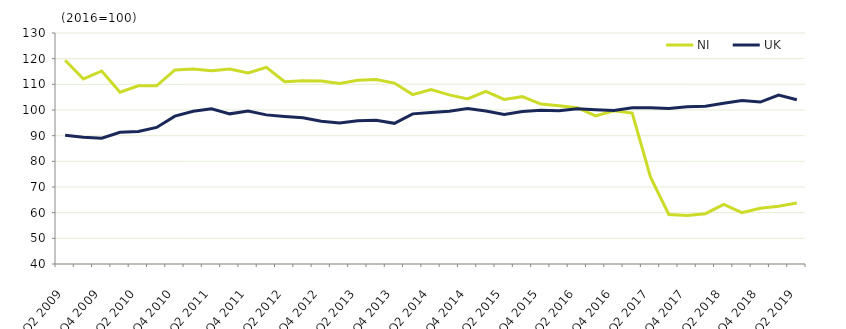
| Category | NI  | UK  |
|---|---|---|
| Q2 2009 | 119.4 | 90.2 |
|  | 112.1 | 89.4 |
| Q4 2009 | 115.2 | 89 |
|  | 106.9 | 91.3 |
| Q2 2010 | 109.4 | 91.6 |
|  | 109.4 | 93.2 |
| Q4 2010 | 115.6 | 97.6 |
|  | 116 | 99.5 |
| Q2 2011 | 115.3 | 100.5 |
|  | 116 | 98.5 |
| Q4 2011 | 114.4 | 99.6 |
|  | 116.6 | 98.1 |
| Q2 2012 | 111 | 97.5 |
|  | 111.4 | 97 |
| Q4 2012 | 111.3 | 95.6 |
|  | 110.3 | 94.9 |
| Q2 2013 | 111.6 | 95.8 |
|  | 111.9 | 96 |
| Q4 2013 | 110.5 | 94.8 |
|  | 106 | 98.5 |
| Q2 2014 | 108 | 99 |
|  | 105.9 | 99.5 |
| Q4 2014 | 104.3 | 100.6 |
|  | 107.3 | 99.6 |
| Q2 2015 | 104.1 | 98.3 |
|  | 105.2 | 99.4 |
| Q4 2015 | 102.3 | 99.9 |
|  | 101.7 | 99.7 |
| Q2 2016 | 100.9 | 100.5 |
|  | 97.7 | 100.1 |
| Q4 2016 | 99.7 | 99.8 |
|  | 98.8 | 100.9 |
| Q2 2017 | 73.8 | 100.9 |
|  | 59.3 | 100.6 |
| Q4 2017 | 58.9 | 101.3 |
|  | 59.6 | 101.5 |
| Q2 2018 | 63.2 | 102.6 |
|  | 60 | 103.7 |
| Q4 2018 | 61.7 | 103.1 |
|  | 62.5 | 105.8 |
| Q2 2019 | 63.8 | 104 |